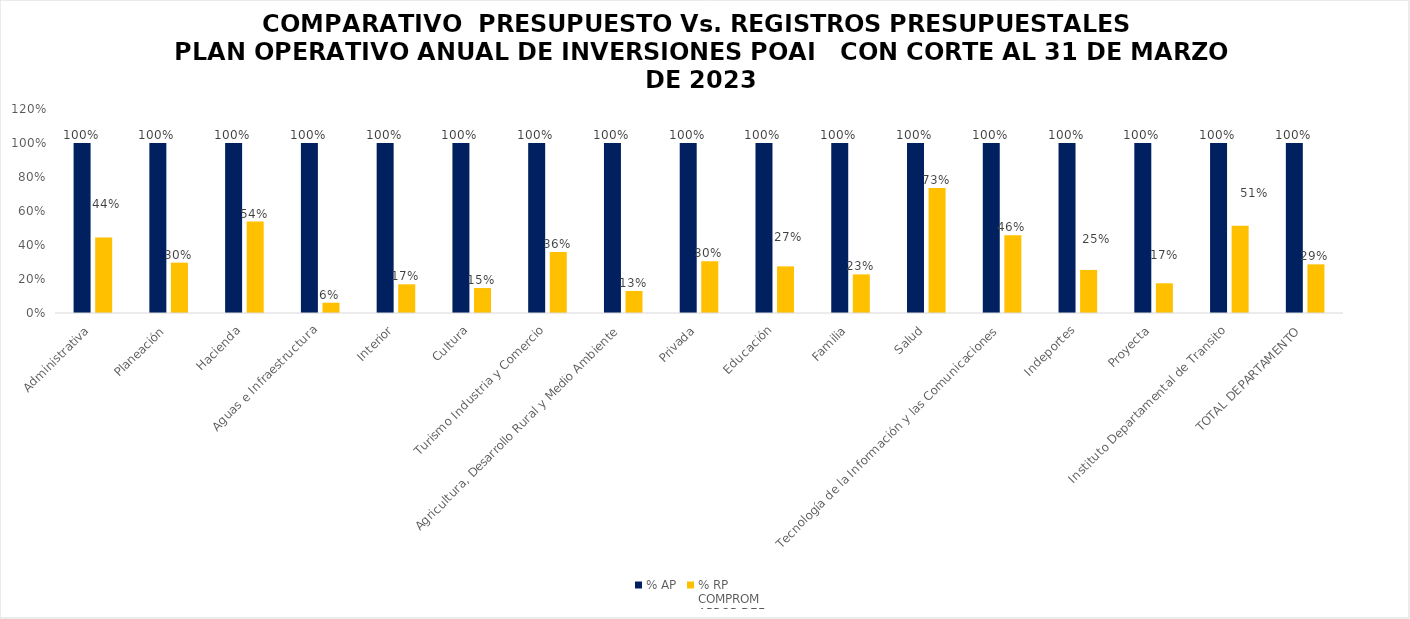
| Category | % AP | % RP
COMPROM
APROP DEF |
|---|---|---|
| Administrativa | 1 | 0.444 |
| Planeación | 1 | 0.296 |
| Hacienda | 1 | 0.538 |
| Aguas e Infraestructura | 1 | 0.061 |
| Interior | 1 | 0.169 |
| Cultura | 1 | 0.147 |
| Turismo Industria y Comercio | 1 | 0.358 |
| Agricultura, Desarrollo Rural y Medio Ambiente | 1 | 0.13 |
| Privada | 1 | 0.305 |
| Educación | 1 | 0.274 |
| Familia | 1 | 0.227 |
| Salud | 1 | 0.735 |
| Tecnología de la Información y las Comunicaciones | 1 | 0.457 |
| Indeportes | 1 | 0.253 |
| Proyecta | 1 | 0.175 |
| Instituto Departamental de Transito | 1 | 0.513 |
| TOTAL DEPARTAMENTO | 1 | 0.286 |